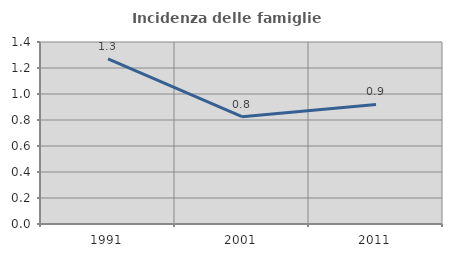
| Category | Incidenza delle famiglie numerose |
|---|---|
| 1991.0 | 1.27 |
| 2001.0 | 0.825 |
| 2011.0 | 0.92 |